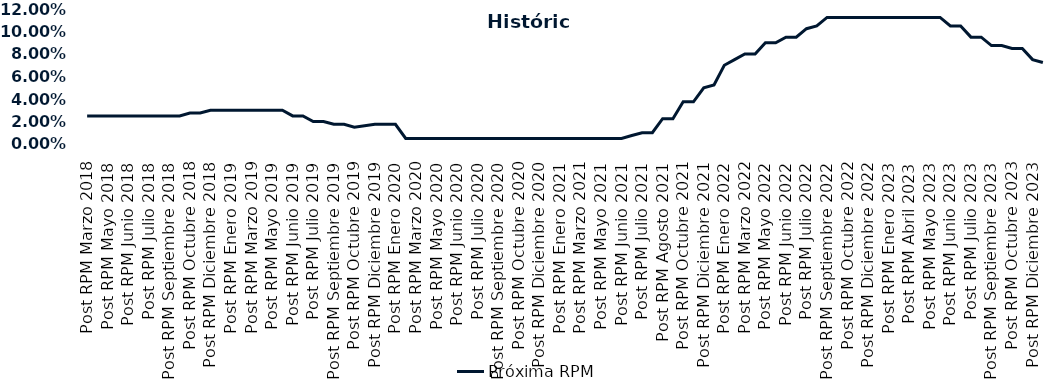
| Category | Próxima RPM |
|---|---|
| Post RPM Marzo 2018 | 0.025 |
| Pre RPM Mayo 2018 | 0.025 |
| Post RPM Mayo 2018 | 0.025 |
| Pre RPM Junio 2018 | 0.025 |
| Post RPM Junio 2018 | 0.025 |
| Pre RPM Julio 2018 | 0.025 |
| Post RPM Julio 2018 | 0.025 |
| Pre RPM Septiembre 2018 | 0.025 |
| Post RPM Septiembre 2018 | 0.025 |
| Pre RPM Octubre 2018 | 0.025 |
| Post RPM Octubre 2018 | 0.028 |
| Pre RPM Diciembre 2018 | 0.028 |
| Post RPM Diciembre 2018 | 0.03 |
| Pre RPM Enero 2019 | 0.03 |
| Post RPM Enero 2019 | 0.03 |
| Pre RPM Marzo 2019 | 0.03 |
| Post RPM Marzo 2019 | 0.03 |
| Pre RPM Mayo 2019 | 0.03 |
| Post RPM Mayo 2019 | 0.03 |
| Pre RPM Junio 2019 | 0.03 |
| Post RPM Junio 2019 | 0.025 |
| Pre RPM Julio 2019 | 0.025 |
| Post RPM Julio 2019 | 0.02 |
| Pre RPM Septiembre 2019 | 0.02 |
| Post RPM Septiembre 2019 | 0.018 |
| Pre RPM Octubre 2019 | 0.018 |
| Post RPM Octubre 2019 | 0.015 |
| Pre RPM Diciembre 2019 | 0.016 |
| Post RPM Diciembre 2019 | 0.018 |
| Pre RPM Enero 2020 | 0.018 |
| Post RPM Enero 2020 | 0.018 |
| Pre RPM Marzo 2020 | 0.005 |
| Post RPM Marzo 2020 | 0.005 |
| Pre RPM Mayo 2020 | 0.005 |
| Post RPM Mayo 2020 | 0.005 |
| Pre RPM Junio 2020 | 0.005 |
| Post RPM Junio 2020 | 0.005 |
| Pre RPM Julio 2020 | 0.005 |
| Post RPM Julio 2020 | 0.005 |
| Pre RPM Septiembre 2020 | 0.005 |
| Post RPM Septiembre 2020 | 0.005 |
| Pre RPM Octubre 2020 | 0.005 |
| Post RPM Octubre 2020 | 0.005 |
| Pre RPM Diciembre 2020 | 0.005 |
| Post RPM Diciembre 2020 | 0.005 |
| Pre RPM Enero 2021 | 0.005 |
| Post RPM Enero 2021 | 0.005 |
| Pre RPM Marzo 2021 | 0.005 |
| Post RPM Marzo 2021 | 0.005 |
| Pre RPM Mayo 2021 | 0.005 |
| Post RPM Mayo 2021 | 0.005 |
| Pre RPM Junio 2021 | 0.005 |
| Post RPM Junio 2021 | 0.005 |
| Pre RPM Julio 2021 | 0.008 |
| Post RPM Julio 2021 | 0.01 |
| Pre RPM Agosto 2021 | 0.01 |
| Post RPM Agosto 2021 | 0.022 |
| Pre RPM Octubre 2021 | 0.022 |
| Post RPM Octubre 2021 | 0.038 |
| Pre RPM Diciembre 2021 | 0.038 |
| Post RPM Diciembre 2021 | 0.05 |
| Pre RPM Enero 2022 | 0.052 |
| Post RPM Enero 2022 | 0.07 |
| Pre RPM Marzo 2022 | 0.075 |
| Post RPM Marzo 2022 | 0.08 |
| Pre RPM Mayo 2022 | 0.08 |
| Post RPM Mayo 2022 | 0.09 |
| Pre RPM Junio 2022 | 0.09 |
| Post RPM Junio 2022 | 0.095 |
| Pre RPM Julio 2022 | 0.095 |
| Post RPM Julio 2022 | 0.102 |
| Pre RPM Septiembre 2022 | 0.105 |
| Post RPM Septiembre 2022 | 0.112 |
| Pre RPM Octubre 2022 | 0.112 |
| Post RPM Octubre 2022 | 0.112 |
| Pre RPM Diciembre 2022 | 0.112 |
| Post RPM Diciembre 2022 | 0.112 |
| Pre RPM Enero 2023 | 0.112 |
| Post RPM Enero 2023 | 0.112 |
| Pre RPM Abril 2023 | 0.112 |
| Post RPM Abril 2023 | 0.112 |
| Pre RPM Mayo 2023 | 0.112 |
| Post RPM Mayo 2023 | 0.112 |
| Pre RPM Junio 2023 | 0.112 |
| Post RPM Junio 2023 | 0.105 |
| Pre RPM Julio 2023 | 0.105 |
| Post RPM Julio 2023 | 0.095 |
| Pre RPM Septiembre 2023 | 0.095 |
| Post RPM Septiembre 2023 | 0.088 |
| Pre RPM Octubre 2023 | 0.088 |
| Post RPM Octubre 2023 | 0.085 |
| Pre RPM Diciembre 2023 | 0.085 |
| Post RPM Diciembre 2023 | 0.075 |
| Pre RPM Enero 2024 | 0.072 |